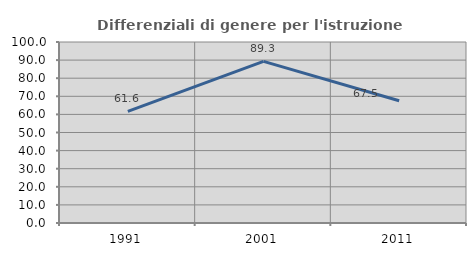
| Category | Differenziali di genere per l'istruzione superiore |
|---|---|
| 1991.0 | 61.635 |
| 2001.0 | 89.286 |
| 2011.0 | 67.522 |